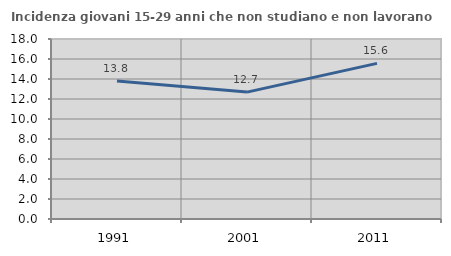
| Category | Incidenza giovani 15-29 anni che non studiano e non lavorano  |
|---|---|
| 1991.0 | 13.793 |
| 2001.0 | 12.688 |
| 2011.0 | 15.565 |